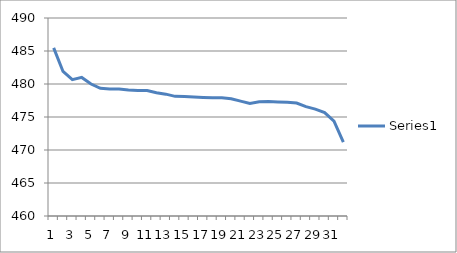
| Category | Series 0 |
|---|---|
| 0 | 485.48 |
| 1 | 481.896 |
| 2 | 480.65 |
| 3 | 481 |
| 4 | 480 |
| 5 | 479.34 |
| 6 | 479.25 |
| 7 | 479.25 |
| 8 | 479.09 |
| 9 | 479.03 |
| 10 | 479.02 |
| 11 | 478.68 |
| 12 | 478.46 |
| 13 | 478.13 |
| 14 | 478.11 |
| 15 | 478.03 |
| 16 | 477.96 |
| 17 | 477.9 |
| 18 | 477.9 |
| 19 | 477.766 |
| 20 | 477.41 |
| 21 | 477.06 |
| 22 | 477.302 |
| 23 | 477.35 |
| 24 | 477.29 |
| 25 | 477.22 |
| 26 | 477.12 |
| 27 | 476.57 |
| 28 | 476.19 |
| 29 | 475.67 |
| 30 | 474.37 |
| 31 | 471.2 |